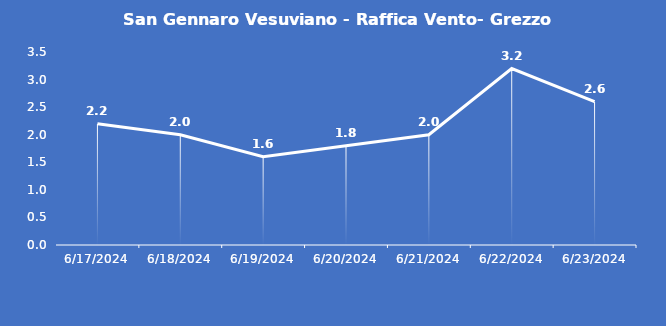
| Category | San Gennaro Vesuviano - Raffica Vento- Grezzo (m/s) |
|---|---|
| 6/17/24 | 2.2 |
| 6/18/24 | 2 |
| 6/19/24 | 1.6 |
| 6/20/24 | 1.8 |
| 6/21/24 | 2 |
| 6/22/24 | 3.2 |
| 6/23/24 | 2.6 |